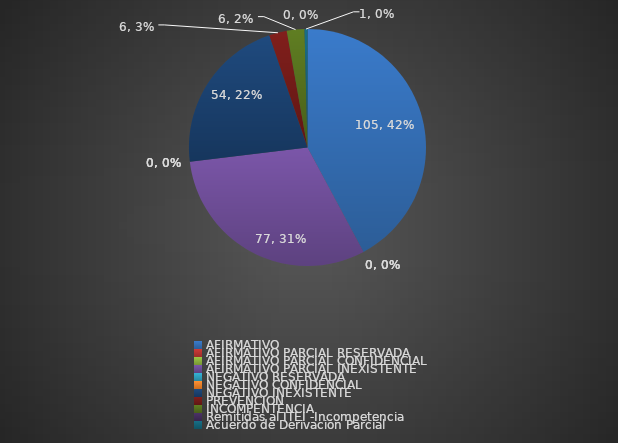
| Category | Series 0 |
|---|---|
| AFIRMATIVO | 105 |
| AFIRMATIVO PARCIAL RESERVADA | 0 |
| AFIRMATIVO PARCIAL CONFIDENCIAL | 0 |
| AFIRMATIVO PARCIAL INEXISTENTE | 77 |
| NEGATIVO RESERVADA | 0 |
| NEGATIVO CONFIDENCIAL | 0 |
| NEGATIVO INEXISTENTE | 54 |
| PREVENCION | 6 |
| INCOMPENTENCIA | 6 |
| Remitidas al ITEI -Incompetencia  | 0 |
| Acuerdo de Derivación Parcial | 1 |